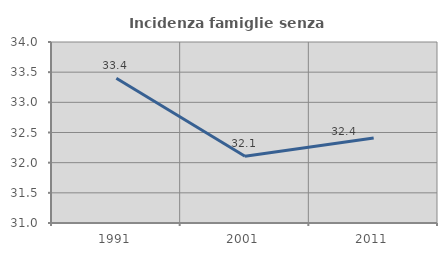
| Category | Incidenza famiglie senza nuclei |
|---|---|
| 1991.0 | 33.398 |
| 2001.0 | 32.107 |
| 2011.0 | 32.407 |